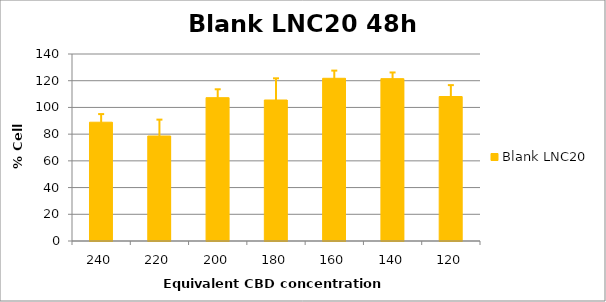
| Category | Blank LNC20 |
|---|---|
| 240.0 | 88.938 |
| 220.0 | 78.614 |
| 200.0 | 107.305 |
| 180.0 | 105.558 |
| 160.0 | 121.812 |
| 140.0 | 121.549 |
| 120.0 | 108.179 |